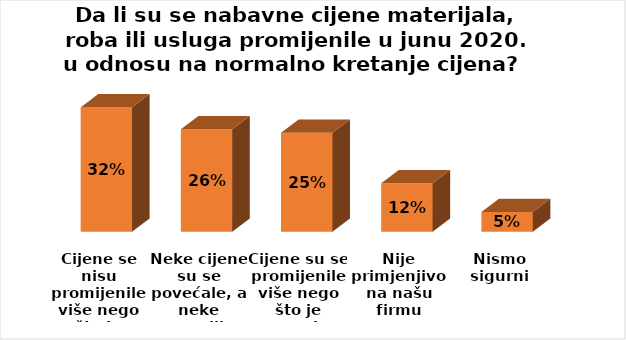
| Category | Series 0 |
|---|---|
| Cijene se nisu promijenile više nego što je normalno | 108 |
| Neke cijene su se povećale, a neke smanjile | 89 |
| Cijene su se promijenile više nego što je normalno | 86 |
| Nije primjenjivo na našu firmu | 42 |
| Nismo sigurni | 17 |